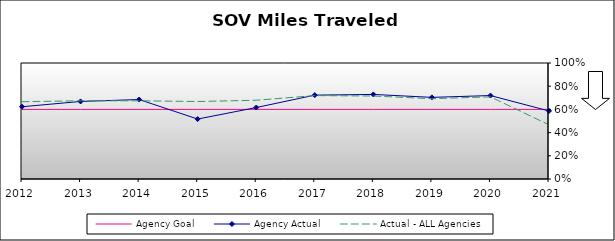
| Category | Agency Goal | Agency Actual | Actual - ALL Agencies |
|---|---|---|---|
| 2012.0 | 0.6 | 0.623 | 0.666 |
| 2013.0 | 0.6 | 0.668 | 0.674 |
| 2014.0 | 0.6 | 0.685 | 0.674 |
| 2015.0 | 0.6 | 0.517 | 0.668 |
| 2016.0 | 0.6 | 0.616 | 0.679 |
| 2017.0 | 0.6 | 0.723 | 0.719 |
| 2018.0 | 0.6 | 0.729 | 0.715 |
| 2019.0 | 0.6 | 0.704 | 0.692 |
| 2020.0 | 0.6 | 0.719 | 0.708 |
| 2021.0 | 0.6 | 0.587 | 0.467 |